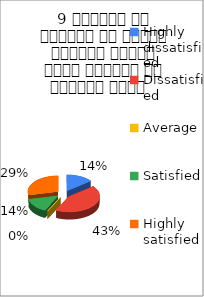
| Category | 9 शिक्षक ने शिक्षण के दौरान आधुनिक तकनीक पावर पॉइन्ट का प्रयोग किया   |
|---|---|
| Highly dissatisfied | 1 |
| Dissatisfied | 3 |
| Average | 0 |
| Satisfied | 1 |
| Highly satisfied | 2 |